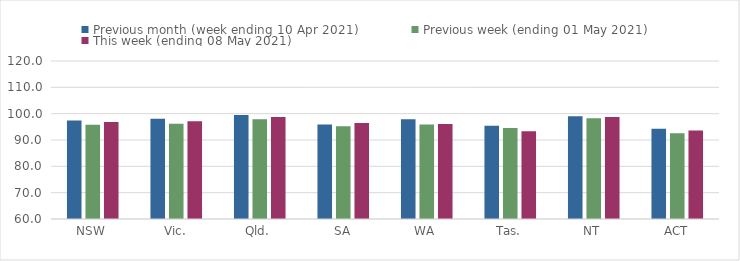
| Category | Previous month (week ending 10 Apr 2021) | Previous week (ending 01 May 2021) | This week (ending 08 May 2021) |
|---|---|---|---|
| NSW | 97.45 | 95.79 | 96.79 |
| Vic. | 98.08 | 96.14 | 97.1 |
| Qld. | 99.52 | 97.86 | 98.74 |
| SA | 95.93 | 95.25 | 96.5 |
| WA | 97.88 | 95.87 | 96.12 |
| Tas. | 95.39 | 94.55 | 93.37 |
| NT | 99.04 | 98.27 | 98.74 |
| ACT | 94.28 | 92.6 | 93.65 |